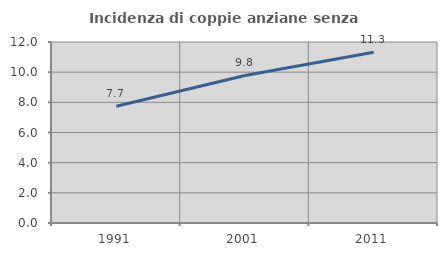
| Category | Incidenza di coppie anziane senza figli  |
|---|---|
| 1991.0 | 7.741 |
| 2001.0 | 9.784 |
| 2011.0 | 11.323 |